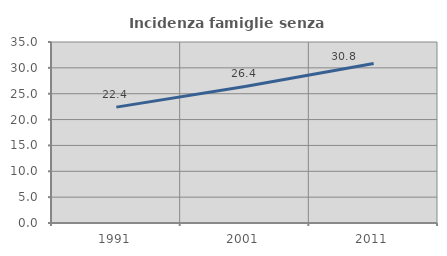
| Category | Incidenza famiglie senza nuclei |
|---|---|
| 1991.0 | 22.405 |
| 2001.0 | 26.404 |
| 2011.0 | 30.847 |